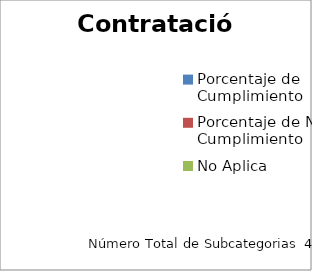
| Category | Contratación |
|---|---|
| Porcentaje de Cumplimiento | 0 |
| Porcentaje de No Cumplimiento | 0 |
| No Aplica | 0 |